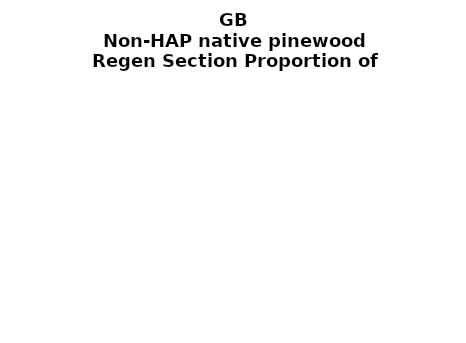
| Category | Non-HAP native pinewood |
|---|---|
| None | 0.224 |
| Seedlings only | 0.005 |
| Seedlings, saplings only | 0.122 |
| Seedlings, saplings, <7 cm trees | 0.053 |
| Saplings only | 0.153 |
| <7 cm trees, seedlings only | 0.006 |
| <7 cm trees, saplings only | 0.259 |
| <7 cm Trees only | 0.178 |